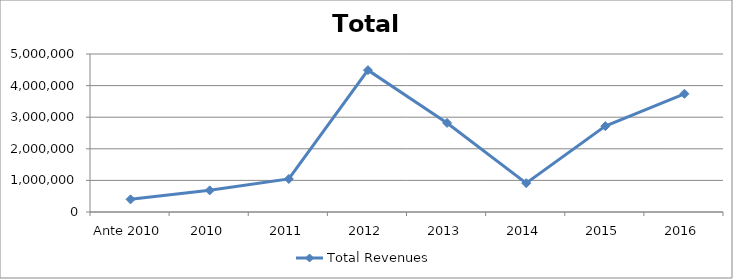
| Category | Total Revenues |
|---|---|
| Ante 2010 | 400000 |
| 2010 | 685000 |
| 2011 | 1045000 |
| 2012 | 4489000 |
| 2013 | 2818616 |
| 2014 | 912621 |
| 2015 | 2716696.667 |
| 2016 | 3740980.647 |